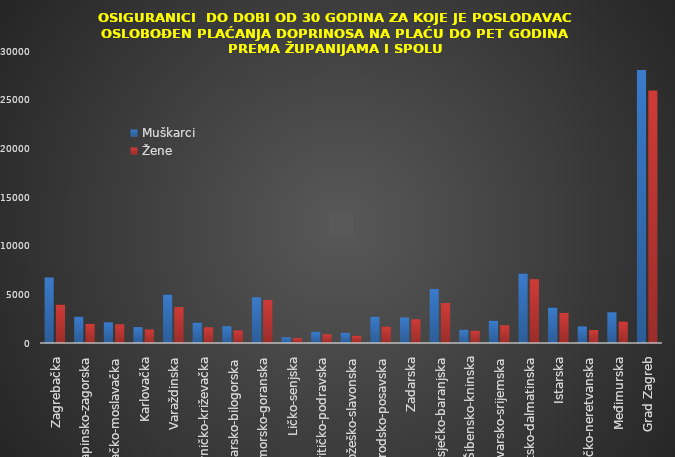
| Category | Muškarci | Žene |
|---|---|---|
| Zagrebačka | 6733 | 3954 |
| Krapinsko-zagorska | 2702 | 1967 |
| Sisačko-moslavačka | 2121 | 1918 |
| Karlovačka | 1631 | 1387 |
| Varaždinska | 4981 | 3690 |
| Koprivničko-križevačka | 2103 | 1616 |
| Bjelovarsko-bilogorska | 1723 | 1297 |
| Primorsko-goranska | 4698 | 4426 |
| Ličko-senjska | 594 | 500 |
| Virovitičko-podravska | 1158 | 899 |
| Požeško-slavonska | 1053 | 745 |
| Brodsko-posavska | 2709 | 1688 |
| Zadarska | 2623 | 2442 |
| Osječko-baranjska | 5556 | 4106 |
| Šibensko-kninska | 1358 | 1255 |
| Vukovarsko-srijemska | 2293 | 1828 |
| Splitsko-dalmatinska | 7134 | 6557 |
| Istarska | 3642 | 3096 |
| Dubrovačko-neretvanska | 1700 | 1332 |
| Međimurska | 3155 | 2208 |
| Grad Zagreb | 28047 | 25944 |